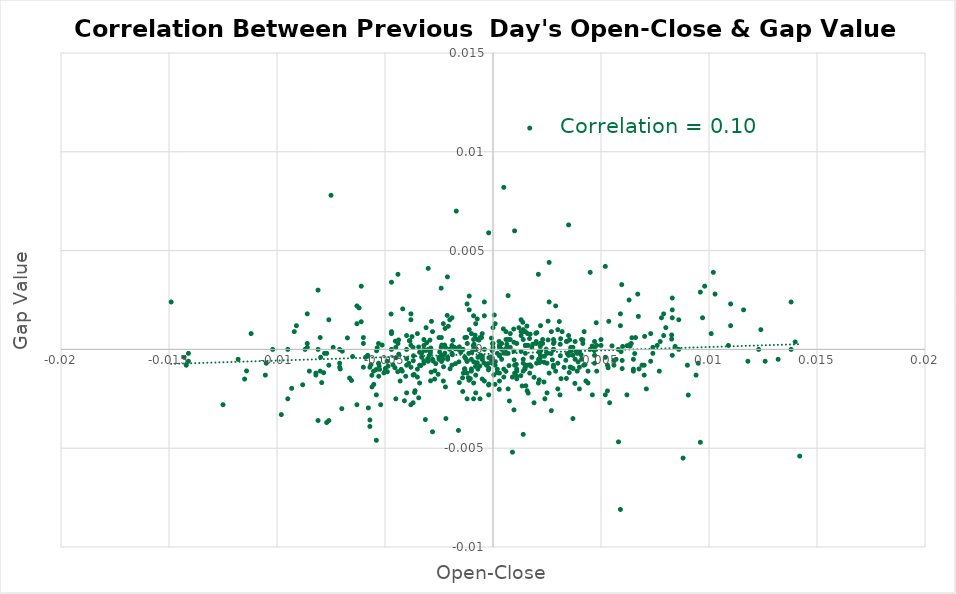
| Category | Series 0 |
|---|---|
| 0.005329999999999946 | -0.001 |
| 0.0038399999999999546 | 0 |
| -2.0000000000020002e-05 | 0 |
| -0.003869999999999929 | 0 |
| -0.00664000000000009 | -0.001 |
| -0.0011400000000000299 | -0.001 |
| -0.0038000000000000256 | 0 |
| 0.0042600000000000415 | -0.001 |
| 0.003149999999999986 | -0.001 |
| -0.0013900000000000023 | 0 |
| -0.0022400000000000198 | 0 |
| -0.005409999999999915 | -0.001 |
| -0.006500000000000061 | 0 |
| -0.0008299999999999974 | 0.001 |
| 0.006429999999999936 | 0.001 |
| 0.006360000000000032 | 0 |
| -0.006979999999999986 | 0 |
| 0.0042200000000000015 | 0.001 |
| 0.003070000000000017 | 0.001 |
| -0.00784000000000007 | -0.001 |
| -0.005129999999999968 | 0 |
| 0.008430000000000049 | 0 |
| -0.0031999999999999806 | -0.001 |
| 0.0023600000000000287 | -0.002 |
| 0.0020200000000000218 | -0.001 |
| -0.0015800000000000258 | -0.001 |
| -0.0045399999999999885 | -0.001 |
| 0.00029000000000001247 | -0.002 |
| 0.004589999999999983 | 0 |
| 0.002829999999999999 | 0 |
| 0.013990000000000058 | 0 |
| -0.007979999999999987 | 0 |
| 0.0012900000000000134 | -0.001 |
| -0.00552000000000008 | -0.002 |
| -0.0011099999999999444 | -0.002 |
| 0.003569999999999962 | -0.001 |
| 0.00827 | 0.001 |
| 0.0014800000000000368 | -0.001 |
| 0.0009700000000000264 | 0 |
| -0.0014899999999999913 | 0 |
| 0.0009700000000000264 | -0.003 |
| 0.0009599999999999609 | 0.001 |
| 0.002690000000000081 | 0 |
| -0.002229999999998955 | 0 |
| -0.0013100000000000334 | 0 |
| -0.0007300000000000084 | -0.001 |
| -0.0007300000000000084 | 0.002 |
| 0.0017099999999999893 | -0.001 |
| -0.0018799999999999928 | 0 |
| -0.0011200000000000099 | 0 |
| -0.009319999999999995 | -0.002 |
| 0.0009700000000000264 | 0 |
| -0.00019000000000002348 | 0 |
| -0.0008200000000000429 | 0.001 |
| -0.0022900000000000142 | -0.001 |
| -0.0012600000000000389 | 0 |
| -0.011410000000000031 | -0.001 |
| -0.0010499999999999954 | -0.001 |
| 0.0004999999999999449 | 0 |
| 0.00827 | 0.001 |
| 0.0065600000000010095 | 0 |
| -0.0014100000000000223 | -0.001 |
| -0.0023800000000000487 | -0.001 |
| -9.999999999998899e-05 | 0 |
| -0.0028599999999999737 | -0.001 |
| 9.00000000000345e-05 | -0.002 |
| 0.0015800000000000258 | -0.002 |
| -0.002689999999998971 | -0.001 |
| -0.004489999999999994 | 0 |
| -0.00019000000000002348 | -0.002 |
| 0.0021100000000000563 | 0 |
| 0.005929999999999991 | 0 |
| -0.005390000000001005 | 0 |
| 0.005979999999999985 | -0.001 |
| -0.0015600000000000058 | -0.002 |
| -0.006739999999999968 | 0.001 |
| 0.000280000000000058 | 0 |
| 0.005359999999998921 | 0.001 |
| -0.010539999999999994 | -0.001 |
| -0.0034399999999999986 | -0.002 |
| 0.005959999999999965 | 0.003 |
| -0.005700000000000038 | -0.004 |
| 0.005809999999999982 | -0.005 |
| -0.0021799999999999597 | -0.004 |
| 0.0 | 0.001 |
| 0.005510000000000015 | 0 |
| 0.0027999999999999137 | 0 |
| 0.0007600000000000939 | -0.003 |
| 0.0022099999999999342 | 0 |
| -0.0023700000000000943 | 0 |
| 0.003369999999999984 | -0.001 |
| -0.0033400000000000096 | -0.001 |
| 0.00010999999999994348 | -0.001 |
| 0.0015700000000000713 | 0.001 |
| -0.0019899999999999363 | -0.001 |
| 6.0000000000060005e-05 | 0.002 |
| -7.00000000000145e-05 | 0.001 |
| -0.0020100000000000673 | 0 |
| 0.003550000000000053 | 0 |
| -0.0012199999999999989 | 0.001 |
| 0.003110000000000057 | 0 |
| -0.003689999999999971 | -0.001 |
| -0.001740000000001074 | -0.001 |
| -0.0013199999999999878 | -0.001 |
| -0.00018999999999891326 | -0.001 |
| 0.0041600000000000525 | 0 |
| 0.003290000000000015 | -0.001 |
| -0.005610000000000004 | -0.001 |
| 0.00019000000000002348 | -0.001 |
| -0.0025399999999999867 | -0.001 |
| 0.0021599999999999397 | 0 |
| 0.0016199999999999548 | 0 |
| 0.0019000000000000128 | -0.001 |
| 0.0031199999999989014 | 0 |
| 0.0021400000000000308 | 0 |
| -0.003170000000000006 | 0 |
| 0.006349999999999967 | 0 |
| -0.0015600000000000058 | 0 |
| -0.0004899999999999904 | 0 |
| 0.007400000000000073 | 0 |
| -0.0040000000000000036 | 0 |
| -0.0024700000000000832 | 0 |
| -0.003089999999999926 | 0 |
| 0.0020299999999999763 | 0.001 |
| -0.0010000000000000009 | -0.001 |
| -0.0028000000000000247 | -0.004 |
| -0.0033000000000000806 | 0 |
| -0.0002300000000000635 | -0.001 |
| -0.0033999999999999586 | 0 |
| 0.0021399999999999197 | -0.001 |
| -0.002850000000000019 | 0.001 |
| 0.00048000000000003595 | 0.001 |
| -0.0008800000000011021 | 0 |
| -0.0049799999999999844 | -0.001 |
| 0.0007000000000000339 | 0.003 |
| -0.0041799999999999615 | 0.002 |
| -0.00277000000000005 | -0.001 |
| 0.000300000000000078 | 0 |
| 0.0022199999999999998 | 0 |
| -0.007929999999999993 | -0.002 |
| 0.0018399999999999528 | 0 |
| -0.005649999999999933 | -0.001 |
| -0.004369999999999985 | 0 |
| -0.0009099999999999664 | 0 |
| 0.0067299999999989035 | 0.002 |
| 0.0060000000000010045 | 0 |
| 0.0017200000000000548 | 0.001 |
| -0.0021099999999999453 | 0.004 |
| 0.003790000000000071 | -0.002 |
| -0.005049999999999999 | -0.001 |
| 0.0014799999999999258 | -0.001 |
| -0.0013999999999989576 | -0.002 |
| -3.999999999992898e-05 | 0 |
| -0.0047200000000000575 | 0.002 |
| 0.0021499999999999853 | -0.001 |
| 0.0041600000000000525 | 0 |
| -4.0000000000040004e-05 | 0 |
| 0.0006000000000000449 | -0.001 |
| 0.0023800000000000487 | 0 |
| 0.005589999999999984 | -0.001 |
| 0.003709999999999991 | -0.001 |
| -0.005249999999999977 | -0.001 |
| -0.0048599999999999755 | -0.001 |
| 0.004079999999998973 | 0 |
| -0.0007700000000000484 | 0 |
| -0.0009799999999999809 | 0 |
| -0.006549999999999945 | -0.002 |
| 0.001080000000000081 | -0.001 |
| -0.005269999999999997 | -0.001 |
| -0.0018599999999999728 | 0 |
| -0.003750000000000031 | 0.001 |
| 0.003530000000000033 | -0.001 |
| 4.0000000000040004e-05 | -0.001 |
| 0.0010899999999999244 | -0.001 |
| 0.0006500000000000394 | 0 |
| -0.00435999999999892 | 0 |
| -7.00000000000145e-05 | 0 |
| 0.0021900000000000253 | 0 |
| -0.0023199999999999887 | 0 |
| 0.005979999999999985 | -0.001 |
| 0.0022199999999999998 | 0 |
| -4.0000000000040004e-05 | -0.001 |
| -0.00041999999999997595 | -0.001 |
| -0.0023999999999999577 | 0 |
| 0.006209999999999938 | 0 |
| -0.0020699999999999052 | 0.001 |
| 0.0007399999999999629 | -0.001 |
| 0.004690000000000083 | 0 |
| 0.0015199999999999658 | -0.002 |
| -0.003650000000000042 | -0.001 |
| 0.009039999999998938 | -0.002 |
| -0.003610000000000002 | -0.002 |
| 0.0025500000000000522 | 0 |
| 0.0010999999999999899 | -0.001 |
| -0.0013699999999999823 | -0.001 |
| -0.0005300000000000304 | 0.001 |
| -0.0005800000000000249 | 0 |
| -0.005770000000000053 | -0.003 |
| 0.0016899999999999693 | 0.001 |
| 0.0034000000000000696 | -0.001 |
| 0.0017700000000000493 | -0.001 |
| 0.0005899999999989802 | 0 |
| -0.004249999999999976 | -0.001 |
| 0.006759999999999988 | -0.001 |
| -0.005360000000000031 | 0 |
| 0.002400000000001068 | -0.002 |
| 0.003130000000000077 | 0.001 |
| -0.003129999999998967 | -0.004 |
| -0.007070000000000021 | -0.001 |
| -0.0028799999999999937 | 0 |
| 0.0023699999999999832 | -0.001 |
| -0.0034399999999999986 | 0 |
| -0.003070000000000017 | 0 |
| -0.004410000000001024 | -0.001 |
| 0.0021400000000000308 | -0.002 |
| -0.002889999999999948 | -0.002 |
| -0.005530000000000035 | -0.001 |
| -0.002650000000000041 | -0.001 |
| -0.0008099999999999774 | -0.001 |
| -0.0036800000000000166 | 0 |
| -0.0017699999999999383 | 0 |
| -0.0045199999999999685 | 0 |
| -0.00020999999999993246 | -0.001 |
| -0.008809999999999985 | -0.002 |
| -0.0040400000000000436 | -0.001 |
| -0.002950000000000008 | 0 |
| -0.0011900000000000244 | 0 |
| -0.005290000000000017 | -0.001 |
| 0.0009799999999999809 | -0.001 |
| -0.0021200000000000108 | 0.002 |
| -0.0006099999999999994 | -0.001 |
| 0.0034399999999999986 | 0 |
| -0.0008900000000000574 | -0.001 |
| 0.00031000000000003247 | 0 |
| -0.0029200000000000337 | 0 |
| -0.0022199999999999998 | 0.001 |
| 0.0016300000000000203 | -0.002 |
| 0.0034399999999999986 | 0 |
| 0.0025500000000010514 | 0.001 |
| -0.0017400000000000748 | 0 |
| -0.0030200000000000227 | 0 |
| -0.0023900000000000032 | 0.001 |
| 0.0024600000000000177 | 0 |
| -0.003630000000000022 | -0.002 |
| 0.007019999999999915 | 0.001 |
| 0.0047800000000000065 | 0.001 |
| 0.0019799999999999818 | 0.001 |
| 0.007739999999999969 | 0 |
| 0.003940000000000055 | -0.001 |
| -0.004890000000000061 | -0.001 |
| -0.00385000000000002 | 0 |
| 0.0013499999999999623 | -0.002 |
| 0.010279999999999956 | 0.003 |
| 0.0013799999999999368 | 0.001 |
| -0.004630000000000023 | -0.001 |
| 0.0027500000000010294 | -0.001 |
| 0.0006400000000010841 | 0 |
| -0.0006500000000000394 | 0 |
| -0.0031999999999989814 | 0 |
| 0.007299999999999973 | 0.001 |
| 0.0046999999999999265 | -0.001 |
| 0.007400000000000073 | 0 |
| -0.0008000000000000229 | -0.001 |
| 0.006900000000000017 | -0.001 |
| 0.0019000000000000128 | -0.003 |
| 0.0010999999999999899 | -0.001 |
| 0.0035999999999989374 | 0 |
| -0.014100000000000001 | 0 |
| -0.0004999999999999449 | 0 |
| 0.008299999999999974 | 0.003 |
| -0.00759999999999994 | -0.001 |
| -0.0039000000000010138 | -0.001 |
| 0.00880000000000003 | -0.005 |
| -0.0010999999999999899 | 0.002 |
| 0.0047999999999999154 | 0 |
| -0.01429999999999998 | 0 |
| 0.0047000000000000375 | 0 |
| -0.0021999999999999797 | 0 |
| 0.005199999999999982 | 0 |
| 0.0044000000000000705 | -0.001 |
| -0.0019000000000000128 | 0 |
| 0.005699999999999927 | -0.001 |
| -0.00759999999999994 | -0.004 |
| -0.0031999999999999806 | 0 |
| 0.00029999999999996696 | -0.002 |
| 0.0014000000000000679 | -0.001 |
| 0.0040000000000000036 | -0.001 |
| -0.008199999999999985 | -0.001 |
| -0.00979999999999992 | -0.003 |
| 0.009600000000001052 | -0.005 |
| 0.0012999999999999678 | 0.001 |
| 0.009400000000000075 | -0.001 |
| 0.009500000000000064 | -0.001 |
| -0.0004999999999999449 | 0.001 |
| 0.0040999999999999925 | 0 |
| 0.0009000000000000119 | -0.005 |
| 0.008299999999999974 | 0.002 |
| -0.0011999999999999789 | -0.003 |
| -0.0044000000000000705 | 0 |
| -0.0029000000000000137 | 0 |
| 0.0037000000000000366 | 0 |
| -0.005900000000000016 | 0 |
| 0.0036000000000000476 | 0 |
| 0.00019999999999997797 | 0 |
| 0.0006000000000000449 | 0.001 |
| 0.008599999999999941 | 0 |
| -0.008099999999999996 | -0.004 |
| 0.0040999999999999925 | -0.001 |
| 0.0042000000000000925 | -0.001 |
| -0.0027000000000000357 | -0.001 |
| -0.004700000000001037 | 0.001 |
| -0.0033999999999999586 | -0.002 |
| -0.005700000000000038 | -0.001 |
| -0.0023999999999999577 | 0 |
| 0.011600000000000055 | 0.002 |
| 0.0006999999999999229 | 0 |
| -0.00539999999999996 | -0.002 |
| 0.0034000000000000696 | 0 |
| -0.007099999999999995 | -0.001 |
| 0.0008000000000000229 | 0.001 |
| 0.0028000000000000247 | -0.001 |
| -0.0009000000000000119 | 0 |
| 0.002100000000000102 | -0.002 |
| 0.0030999999999999917 | -0.002 |
| 0.007000000000000006 | -0.001 |
| 0.0015000000000000568 | -0.001 |
| 0.0028000000000000247 | 0 |
| 0.008299999999999974 | 0 |
| 0.006199999999999983 | -0.002 |
| 0.0045000000000000595 | 0 |
| 0.0025000000000000577 | -0.002 |
| -0.0040999999999999925 | -0.003 |
| 0.00770000000000004 | -0.001 |
| -0.00040000000000006697 | 0 |
| -0.0011999999999999789 | 0.002 |
| 0.0037999999999999146 | -0.001 |
| -0.008099999999999996 | 0 |
| 0.0025999999999999357 | -0.001 |
| -0.014899999999999913 | 0.002 |
| 0.0048000000000000265 | -0.001 |
| 0.012399999999999967 | 0.001 |
| -0.0034999999999999476 | -0.001 |
| -0.0006999999999989237 | 0.001 |
| -0.002400000000001068 | 0.003 |
| 0.0036000000000000476 | -0.001 |
| 0.0007999999999989127 | 0 |
| 0.0046000000000000485 | -0.002 |
| 0.0021999999999999797 | 0 |
| -0.0009000000000000119 | 0.002 |
| 0.005199999999999982 | -0.002 |
| -0.0019000000000000128 | -0.001 |
| 0.0015000000000000568 | 0 |
| 0.0037000000000000366 | 0 |
| 0.00649999999999995 | -0.001 |
| 0.0030000000000000027 | -0.002 |
| -0.0020999999999999908 | 0 |
| -0.0030000000000000027 | 0.004 |
| -0.006299999999999972 | 0.002 |
| 0.005299999999999971 | -0.002 |
| -0.0032999999999999696 | 0 |
| 0.0035000000000000586 | 0.001 |
| 0.0050000000000000044 | 0.001 |
| 0.01319999999999999 | -0.001 |
| 0.006399999999999961 | 0 |
| 0.0029000000000000137 | 0.002 |
| 0.0038000000000000256 | 0 |
| -0.0021999999999999797 | -0.002 |
| 0.0024999999999999467 | -0.001 |
| 0.00019999999999997797 | -0.001 |
| 0.00039999999999995595 | 0 |
| 0.0014000000000000679 | 0.001 |
| -0.0010000000000000009 | -0.001 |
| 0.0018000000000000238 | 0 |
| -0.0019000000000000128 | 0.002 |
| 0.0007000000000000339 | 0 |
| 0.0012999999999999678 | 0.001 |
| 0.00039999999999995595 | 0 |
| 0.0020000000000000018 | 0 |
| 0.0018000000000000238 | 0 |
| 0.0 | 0 |
| -0.0011999999999999789 | -0.001 |
| 0.0016000000000000458 | -0.001 |
| 0.0014999999999999458 | 0.001 |
| 0.0029999999999988924 | 0.001 |
| -0.0031999999999999806 | 0.001 |
| -0.0014000000000000679 | 0 |
| -0.0012999999999999678 | -0.001 |
| -0.0007999999999989127 | 0 |
| -0.005600000000001049 | -0.002 |
| 0.0014000000000000679 | 0.001 |
| -0.0006000000000000449 | 0.001 |
| 0.0010999999999989907 | 0 |
| 0.0008000000000000229 | 0 |
| -0.0005999999999999339 | -0.002 |
| 0.0023000000000000798 | 0 |
| -0.0028000000000000247 | 0 |
| -0.0050000000000000044 | -0.001 |
| 0.007900000000000018 | 0.002 |
| 0.007599999999998941 | 0 |
| 0.009000000000000008 | -0.001 |
| -0.004900000000001015 | -0.001 |
| -0.00869999999999893 | 0 |
| 0.0012999999999999678 | 0.001 |
| -0.00040000000000006697 | 0.002 |
| -0.0018000000000000238 | 0 |
| -0.005999999999998895 | 0.001 |
| -0.0010999999999999899 | 0.003 |
| 0.0014000000000000679 | -0.001 |
| -0.004700000000001037 | 0.003 |
| 0.007799999999999918 | 0.002 |
| -0.0007000000000000339 | -0.001 |
| 0.007900000000000018 | 0.001 |
| -0.0023000000000000798 | -0.002 |
| -0.0031999999999999806 | -0.001 |
| -0.002400000000001068 | 0 |
| 0.0014000000000000679 | 0 |
| 0.001100000000000101 | -0.001 |
| 0.0004999999999999449 | 0.008 |
| -0.011199999999999988 | 0.001 |
| 0.004499999999998949 | 0.004 |
| 0.003200000000001091 | 0.001 |
| -0.0024999999999999467 | 0.001 |
| -0.0022999999999989695 | 0 |
| 0.005900000000000016 | -0.008 |
| 0.000300000000000078 | 0 |
| 0.0026000000000000467 | 0.002 |
| 0.010199999999999987 | 0.004 |
| 0.012600000000000056 | -0.001 |
| 0.007299999999999973 | -0.001 |
| 0.0020000000000000018 | 0 |
| 0.0059000000000010155 | 0.001 |
| 0.01419999999999999 | -0.005 |
| 0.013800000000000034 | 0.002 |
| 0.006299999999999972 | 0.003 |
| 0.009599999999999942 | 0.003 |
| 0.01089999999999991 | 0 |
| -0.0038000000000000256 | -0.001 |
| 0.0022999999999999687 | 0 |
| 0.0003000000000010772 | -0.001 |
| 0.0043999999999999595 | -0.002 |
| -0.0008000000000000229 | -0.002 |
| 0.00039999999999995595 | -0.001 |
| -0.0040000000000000036 | -0.001 |
| -0.005699999999998928 | -0.004 |
| 0.00649999999999995 | -0.001 |
| -0.00019999999999997797 | -0.002 |
| -0.0042999999999999705 | -0.002 |
| 0.005300000000000082 | -0.001 |
| -0.0020000000000000018 | 0.002 |
| -0.006099999999999994 | 0.003 |
| 0.0009000000000000119 | -0.001 |
| 0.0 | 0 |
| 0.009800000000000031 | 0.003 |
| -0.0019000000000000128 | 0 |
| 0.0015000000000000568 | 0 |
| 0.01100000000000001 | 0.001 |
| -0.0030000000000000027 | 0 |
| 0.00029999999999996696 | 0 |
| 0.0021999999999999797 | 0 |
| -0.00770000000000004 | 0 |
| -0.0030999999999999917 | 0.001 |
| -0.0010000000000000009 | 0.001 |
| 0.0028000000000000247 | -0.001 |
| -0.0029000000000000137 | 0 |
| 0.0039000000000000146 | 0 |
| 9.999999999998899e-05 | 0.001 |
| 0.0039000000000000146 | -0.001 |
| 0.0010000000000000009 | -0.001 |
| 0.0006000000000000449 | 0.001 |
| 0.0026999999999989255 | 0.001 |
| -0.011500000000000066 | -0.002 |
| -0.005199999999999982 | -0.003 |
| 0.0021999999999999797 | 0.001 |
| 0.0047000000000000375 | 0 |
| -0.0011999999999989797 | -0.001 |
| -0.009499999999999953 | 0 |
| -0.009200000000000097 | 0.001 |
| 0.0040000000000000036 | -0.002 |
| -0.006099999999999994 | 0.001 |
| 0.006500000000000061 | 0 |
| -0.014099999999998891 | -0.001 |
| -0.0024999999999989475 | 0 |
| -0.0044000000000000705 | 0.004 |
| -0.0017000000000000348 | 0.007 |
| -0.000300000000000078 | -0.001 |
| 0.0010000000000000009 | 0.006 |
| 0.008599999999999941 | 0.001 |
| 0.0012999999999999678 | 0 |
| 0.00539999999999996 | -0.003 |
| -0.008599999999999941 | 0 |
| -0.0034999999999999476 | -0.001 |
| 0.008299999999999974 | 0.002 |
| -0.0037000000000000366 | -0.003 |
| -0.00019999999999997797 | 0.006 |
| -0.007099999999998996 | -0.001 |
| -0.005300000000000082 | 0 |
| 0.0026999999999999247 | -0.003 |
| 0.009700000000000042 | 0.002 |
| 0.0014000000000000679 | 0.001 |
| 0.0034999999999999476 | 0.006 |
| 0.006699999999999928 | 0.003 |
| -0.0037000000000000366 | 0 |
| -0.0037000000000000366 | -0.001 |
| -0.0035000000000000586 | 0.001 |
| -0.0009000000000000119 | -0.002 |
| 0.0004999999999989457 | -0.001 |
| -0.005300000000000082 | -0.001 |
| -0.00019999999999997797 | -0.002 |
| -0.006199999999999983 | 0.002 |
| -0.0030000000000000027 | -0.001 |
| 0.0026000000000000467 | 0.004 |
| 0.0016999999999999238 | 0.011 |
| 0.0021999999999999797 | -0.001 |
| -0.007500000000000062 | 0.008 |
| 0.0020999999999999908 | 0.004 |
| 0.0030000000000000027 | -0.001 |
| -0.008499999999999952 | -0.001 |
| -0.012500000000000067 | -0.003 |
| 0.0010000000000000009 | -0.001 |
| 0.008000000000000007 | 0.001 |
| 0.010099999999999998 | 0.001 |
| -0.005400000000000071 | -0.005 |
| 0.011800000000000033 | -0.001 |
| 0.0037000000000000366 | -0.004 |
| -0.008599999999999941 | 0.002 |
| 0.0012000000000000899 | 0.001 |
| -0.0040000000000000036 | 0.001 |
| -0.01419999999999999 | -0.001 |
| -0.009099999999999997 | 0.001 |
| -0.0011999999999999789 | -0.001 |
| -0.0007999999999999119 | 0.001 |
| -0.0045000000000000595 | -0.003 |
| -0.0009000000000010111 | 0.001 |
| 0.0042999999999999705 | -0.002 |
| -0.007000000000000006 | -0.003 |
| 0.005600000000000049 | -0.001 |
| 9.999999999998899e-05 | -0.001 |
| -0.008000000000000007 | -0.001 |
| -0.0038000000000000256 | -0.003 |
| 0.007099999999999995 | -0.002 |
| -0.0022999999999989695 | 0.001 |
| -0.006000000000000005 | -0.001 |
| 0.0005999999999999339 | 0 |
| -0.0045000000000000595 | 0 |
| -0.006000000000000005 | 0 |
| -0.008000000000000007 | 0.001 |
| -0.0020999999999999908 | -0.001 |
| -0.008600000000000052 | 0 |
| -0.008199999999999985 | -0.001 |
| 0.0017000000000000348 | -0.001 |
| -0.0004999999999999449 | -0.001 |
| -0.0027999999999999137 | 0.001 |
| 0.0014000000000000679 | -0.004 |
| 0.0028999999999999027 | -0.001 |
| -0.0015999999999999348 | -0.004 |
| -0.0033999999999999586 | -0.001 |
| 0.005899999999999905 | 0.002 |
| -0.0040000000000000036 | -0.002 |
| -0.00770000000000004 | -0.004 |
| 0.0006999999999999229 | -0.002 |
| 0.0050000000000000044 | 0 |
| 0.0025000000000000577 | 0 |
| -0.009500000000000064 | -0.003 |
| 0.01100000000000001 | 0.002 |
| 0.0015999999999999348 | 0.001 |
| 0.005199999999999982 | 0.004 |
| -0.00039999999999995595 | -0.002 |
| -0.011800000000000033 | 0 |
| -0.00040000000000006697 | 0.002 |
| -0.0004999999999999449 | 0 |
| -0.0046999999999999265 | 0.001 |
| -0.007600000000000051 | 0.001 |
| -0.006299999999999972 | 0.001 |
| -0.0010999999999999899 | 0.001 |
| -0.0037999999999999146 | 0.002 |
| -0.006299999999999972 | -0.003 |
| -0.008099999999999996 | 0.003 |
| -0.0009000000000000119 | -0.002 |
| 0.00660000000000005 | 0.001 |
| -0.0041999999999999815 | -0.001 |
| -0.0023999999999999577 | 0 |
| -0.0010000000000000009 | -0.001 |
| 0.012299999999999978 | 0 |
| -0.0012999999999999678 | 0.001 |
| 0.0027999999999999137 | 0 |
| -0.005799999999998917 | 0 |
| -0.0029000000000000137 | 0 |
| -0.0046999999999999265 | 0 |
| 0.013800000000000034 | 0 |
| 0.0036000000000000476 | 0 |
| -0.010199999999998988 | 0 |
| 0.005800000000000027 | 0 |
| 0.00029999999999896776 | 0 |
| -0.0025000000000000577 | -0.001 |
| -0.007800000000000029 | 0 |
| 0.0047000000000000375 | 0 |
| -0.007399999999998963 | 0 |
| 0.0028000000000000247 | 0 |
| 0.001500000000001056 | 0 |
| 0.007000000000000006 | -0.001 |
| -0.0015999999999989356 | 0 |
| -0.010499999999999954 | -0.001 |
| -0.007099999999999995 | 0 |
| -0.0038000000000000256 | 0.001 |
| 0.000500000000000056 | -0.001 |
| -0.0007000000000000339 | 0 |
| 0.0040000000000000036 | 0 |
| 0.0034999999999999476 | 0 |
| 0.0047000000000000375 | 0 |
| -0.0040000000000000036 | 0 |